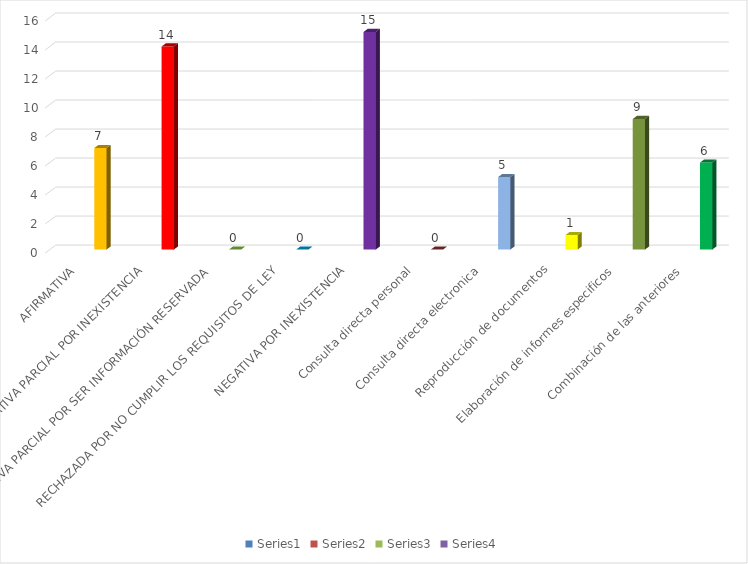
| Category | Series 0 | Series 1 | Series 2 | Series 3 |
|---|---|---|---|---|
| AFIRMATIVA |  |  |  | 7 |
| AFIRMATIVA PARCIAL POR INEXISTENCIA |  |  |  | 14 |
| AFIRMATIVA PARCIAL POR SER INFORMACIÓN RESERVADA |  |  |  | 0 |
| RECHAZADA POR NO CUMPLIR LOS REQUISITOS DE LEY |  |  |  | 0 |
| NEGATIVA POR INEXISTENCIA |  |  |  | 15 |
| Consulta directa personal |  |  |  | 0 |
| Consulta directa electronica |  |  |  | 5 |
| Reproducción de documentos |  |  |  | 1 |
| Elaboración de informes especificos |  |  |  | 9 |
| Combinación de las anteriores |  |  |  | 6 |